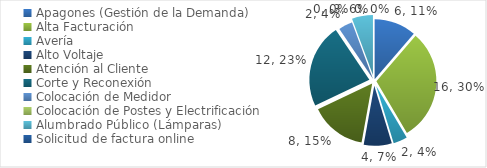
| Category | Series 0 |
|---|---|
| Apagones (Gestión de la Demanda) | 6 |
| Alta Facturación | 16 |
| Avería | 2 |
| Alto Voltaje | 4 |
| Atención al Cliente | 8 |
| Corte y Reconexión  | 12 |
| Colocación de Medidor | 2 |
| Colocación de Postes y Electrificación  | 0 |
| Alumbrado Público (Lámparas) | 3 |
| Solicitud de factura online | 0 |